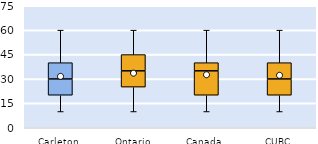
| Category | 25th | 50th | 75th |
|---|---|---|---|
| Carleton | 20 | 10 | 10 |
| Ontario | 25 | 10 | 10 |
| Canada | 20 | 15 | 5 |
| CUBC | 20 | 10 | 10 |